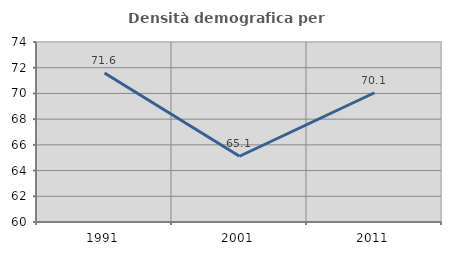
| Category | Densità demografica |
|---|---|
| 1991.0 | 71.585 |
| 2001.0 | 65.115 |
| 2011.0 | 70.054 |